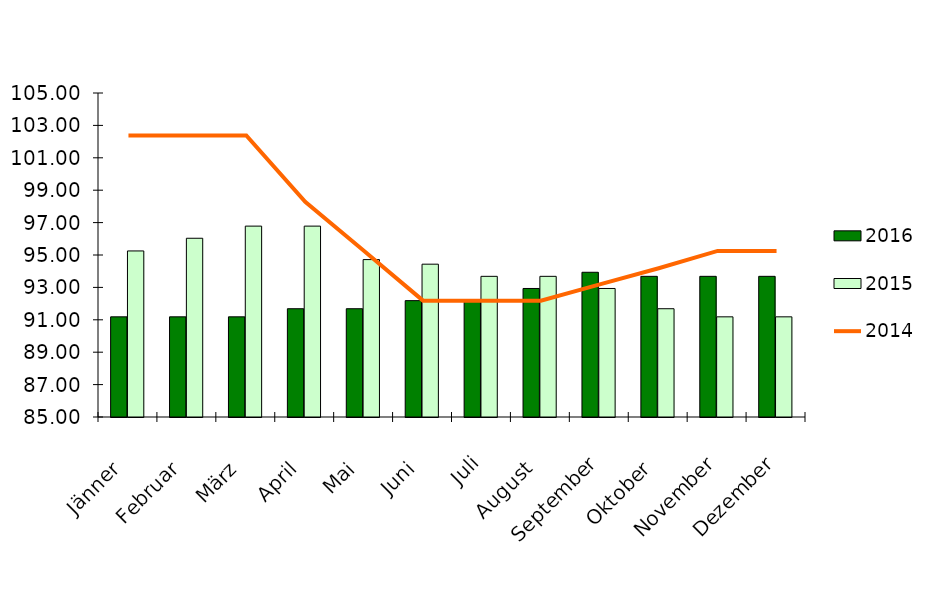
| Category | 2016 | 2015 |
|---|---|---|
| Jänner | 91.183 | 95.25 |
| Februar | 91.183 | 96.033 |
| März | 91.183 | 96.783 |
| April | 91.683 | 96.783 |
| Mai | 91.683 | 94.717 |
| Juni | 92.183 | 94.433 |
| Juli | 92.183 | 93.683 |
| August | 92.933 | 93.683 |
| September | 93.933 | 92.933 |
| Oktober | 93.683 | 91.683 |
| November | 93.683 | 91.183 |
| Dezember | 93.683 | 91.183 |